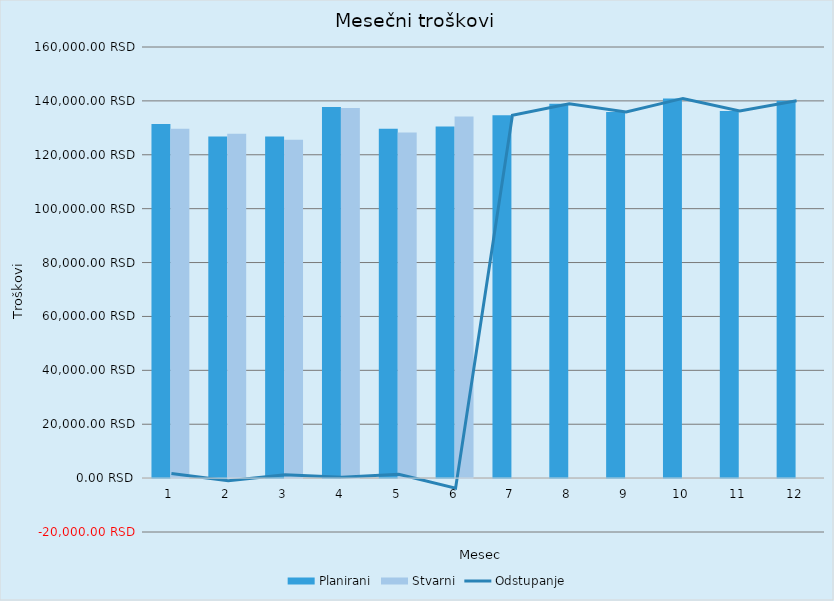
| Category | Planirani | Stvarni |
|---|---|---|
| 0 | 131420 | 129682 |
| 1 | 126820 | 127804 |
| 2 | 126820 | 125565 |
| 3 | 137695 | 137394 |
| 4 | 129695 | 128255 |
| 5 | 130495 | 134239 |
| 6 | 134695 | 0 |
| 7 | 138918 | 0 |
| 8 | 135918 | 0 |
| 9 | 140918 | 0 |
| 10 | 136218 | 0 |
| 11 | 140018 | 0 |